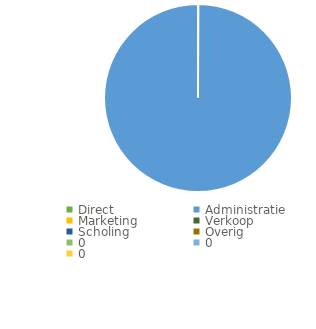
| Category | Series 0 |
|---|---|
| Direct | 0 |
| Administratie | 1 |
| Marketing | 0 |
| Verkoop | 0 |
| Scholing | 0 |
| Overig | 0 |
| 0 | 0 |
| 0 | 0 |
| 0 | 0 |